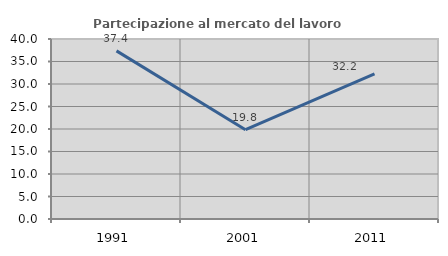
| Category | Partecipazione al mercato del lavoro  femminile |
|---|---|
| 1991.0 | 37.361 |
| 2001.0 | 19.839 |
| 2011.0 | 32.229 |